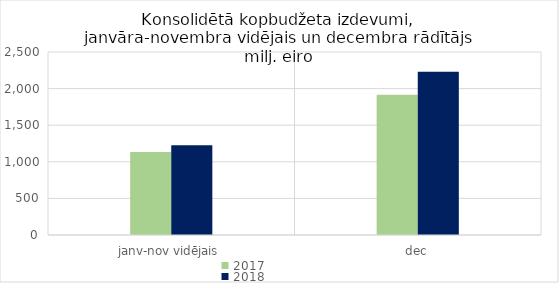
| Category | 2017 | 2018 |
|---|---|---|
| janv-nov vidējais | 1135017.807 | 1226693.247 |
| dec | 1915376.849 | 2230910.603 |